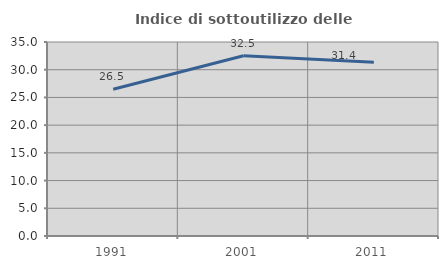
| Category | Indice di sottoutilizzo delle abitazioni  |
|---|---|
| 1991.0 | 26.471 |
| 2001.0 | 32.51 |
| 2011.0 | 31.361 |